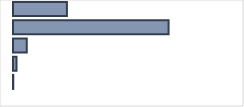
| Category | Series 0 |
|---|---|
| 0 | 23.749 |
| 1 | 68.53 |
| 2 | 6.076 |
| 3 | 1.523 |
| 4 | 0.121 |